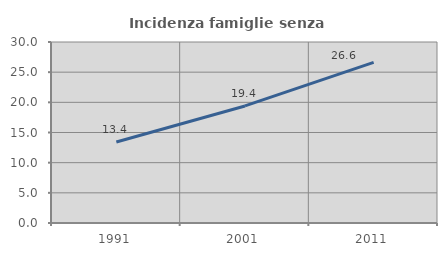
| Category | Incidenza famiglie senza nuclei |
|---|---|
| 1991.0 | 13.418 |
| 2001.0 | 19.402 |
| 2011.0 | 26.625 |